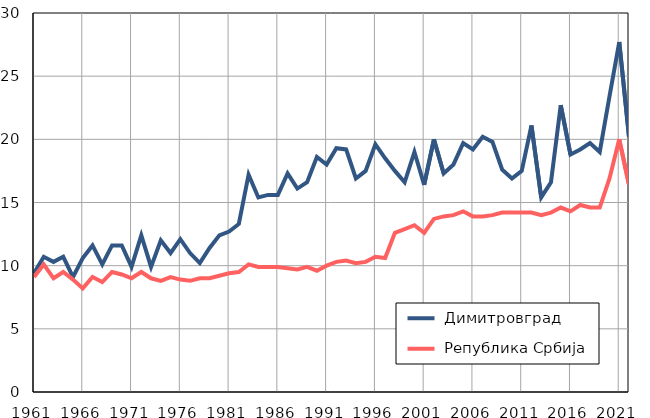
| Category |  Димитровград |  Република Србија |
|---|---|---|
| 1961.0 | 9.4 | 9.1 |
| 1962.0 | 10.7 | 10.1 |
| 1963.0 | 10.3 | 9 |
| 1964.0 | 10.7 | 9.5 |
| 1965.0 | 9.1 | 8.9 |
| 1966.0 | 10.6 | 8.2 |
| 1967.0 | 11.6 | 9.1 |
| 1968.0 | 10.1 | 8.7 |
| 1969.0 | 11.6 | 9.5 |
| 1970.0 | 11.6 | 9.3 |
| 1971.0 | 9.9 | 9 |
| 1972.0 | 12.4 | 9.5 |
| 1973.0 | 9.9 | 9 |
| 1974.0 | 12 | 8.8 |
| 1975.0 | 11 | 9.1 |
| 1976.0 | 12.1 | 8.9 |
| 1977.0 | 11 | 8.8 |
| 1978.0 | 10.2 | 9 |
| 1979.0 | 11.4 | 9 |
| 1980.0 | 12.4 | 9.2 |
| 1981.0 | 12.7 | 9.4 |
| 1982.0 | 13.3 | 9.5 |
| 1983.0 | 17.2 | 10.1 |
| 1984.0 | 15.4 | 9.9 |
| 1985.0 | 15.6 | 9.9 |
| 1986.0 | 15.6 | 9.9 |
| 1987.0 | 17.3 | 9.8 |
| 1988.0 | 16.1 | 9.7 |
| 1989.0 | 16.6 | 9.9 |
| 1990.0 | 18.6 | 9.6 |
| 1991.0 | 18 | 10 |
| 1992.0 | 19.3 | 10.3 |
| 1993.0 | 19.2 | 10.4 |
| 1994.0 | 16.9 | 10.2 |
| 1995.0 | 17.5 | 10.3 |
| 1996.0 | 19.6 | 10.7 |
| 1997.0 | 18.5 | 10.6 |
| 1998.0 | 17.5 | 12.6 |
| 1999.0 | 16.6 | 12.9 |
| 2000.0 | 19 | 13.2 |
| 2001.0 | 16.4 | 12.6 |
| 2002.0 | 20 | 13.7 |
| 2003.0 | 17.3 | 13.9 |
| 2004.0 | 18 | 14 |
| 2005.0 | 19.7 | 14.3 |
| 2006.0 | 19.2 | 13.9 |
| 2007.0 | 20.2 | 13.9 |
| 2008.0 | 19.8 | 14 |
| 2009.0 | 17.6 | 14.2 |
| 2010.0 | 16.9 | 14.2 |
| 2011.0 | 17.5 | 14.2 |
| 2012.0 | 21.1 | 14.2 |
| 2013.0 | 15.4 | 14 |
| 2014.0 | 16.6 | 14.2 |
| 2015.0 | 22.7 | 14.6 |
| 2016.0 | 18.8 | 14.3 |
| 2017.0 | 19.2 | 14.8 |
| 2018.0 | 19.7 | 14.6 |
| 2019.0 | 19 | 14.6 |
| 2020.0 | 23.4 | 16.9 |
| 2021.0 | 27.7 | 20 |
| 2022.0 | 20.2 | 16.4 |